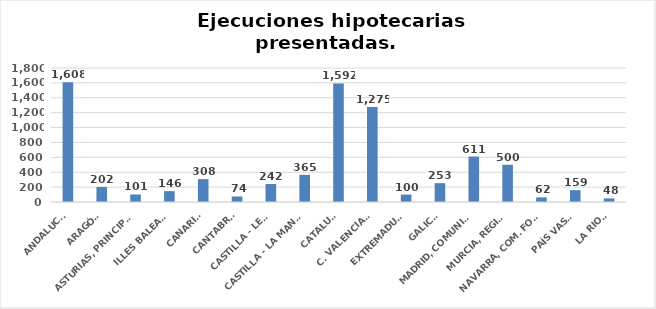
| Category | Series 0 |
|---|---|
| ANDALUCÍA | 1608 |
| ARAGÓN | 202 |
| ASTURIAS, PRINCIPADO | 101 |
| ILLES BALEARS | 146 |
| CANARIAS | 308 |
| CANTABRIA | 74 |
| CASTILLA - LEÓN | 242 |
| CASTILLA - LA MANCHA | 365 |
| CATALUÑA | 1592 |
| C. VALENCIANA | 1275 |
| EXTREMADURA | 100 |
| GALICIA | 253 |
| MADRID, COMUNIDAD | 611 |
| MURCIA, REGIÓN | 500 |
| NAVARRA, COM. FORAL | 62 |
| PAÍS VASCO | 159 |
| LA RIOJA | 48 |